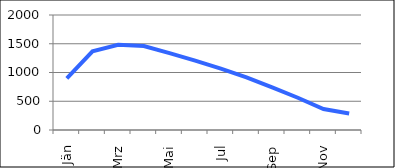
| Category | Series 0 |
|---|---|
| Jän | 899.702 |
| Feb | 1368.637 |
| Mrz | 1481.385 |
| Apr | 1459.764 |
| Mai | 1338.011 |
| Jun | 1206.87 |
| Jul | 1066.342 |
| Aug | 916.425 |
| Sep | 741.259 |
| Okt | 561.04 |
| Nov | 365.272 |
| Dez | 288.469 |